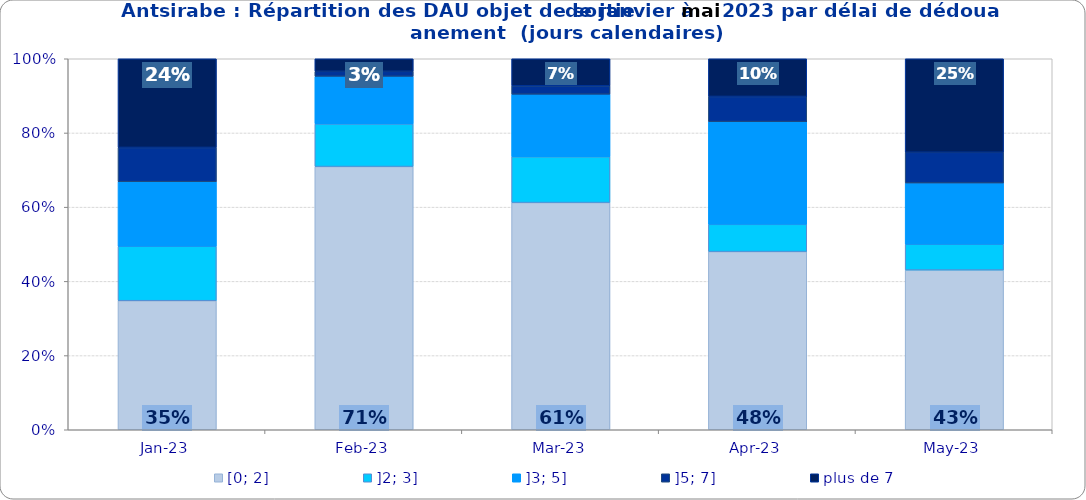
| Category | [0; 2] | ]2; 3] | ]3; 5] | ]5; 7] | plus de 7 |
|---|---|---|---|---|---|
| 2023-01-01 | 0.348 | 0.147 | 0.174 | 0.092 | 0.239 |
| 2023-02-01 | 0.709 | 0.115 | 0.128 | 0.014 | 0.034 |
| 2023-03-01 | 0.612 | 0.124 | 0.169 | 0.022 | 0.073 |
| 2023-04-01 | 0.48 | 0.073 | 0.277 | 0.068 | 0.102 |
| 2023-05-01 | 0.43 | 0.07 | 0.165 | 0.083 | 0.252 |